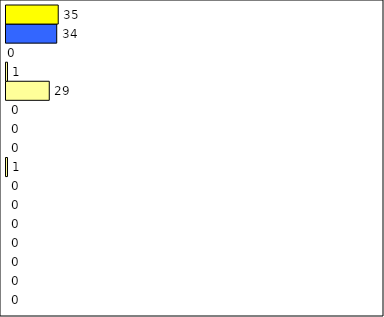
| Category | -2 | -1 | 0 | 1 | 2 | 3 | 4 | 5 | 6 | 7 | 8 | 9 | 10 | 11 | 12 | Perfect Round |
|---|---|---|---|---|---|---|---|---|---|---|---|---|---|---|---|---|
| 0 | 0 | 0 | 0 | 0 | 0 | 0 | 0 | 1 | 0 | 0 | 0 | 29 | 1 | 0 | 34 | 35 |